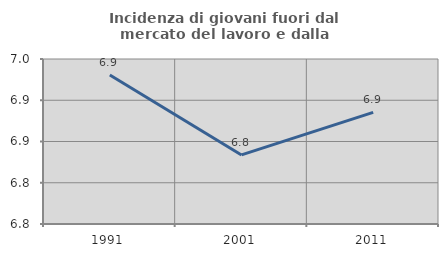
| Category | Incidenza di giovani fuori dal mercato del lavoro e dalla formazione  |
|---|---|
| 1991.0 | 6.931 |
| 2001.0 | 6.834 |
| 2011.0 | 6.885 |